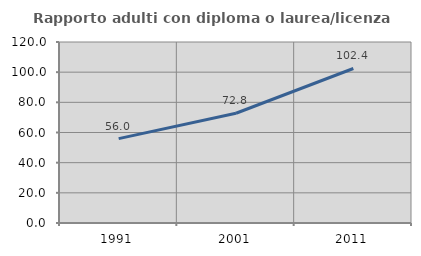
| Category | Rapporto adulti con diploma o laurea/licenza media  |
|---|---|
| 1991.0 | 55.96 |
| 2001.0 | 72.769 |
| 2011.0 | 102.434 |